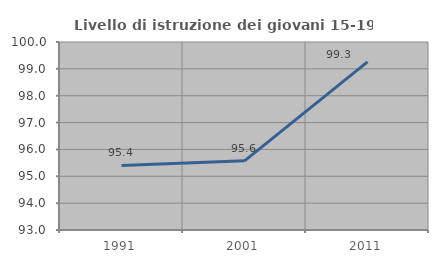
| Category | Livello di istruzione dei giovani 15-19 anni |
|---|---|
| 1991.0 | 95.402 |
| 2001.0 | 95.576 |
| 2011.0 | 99.257 |